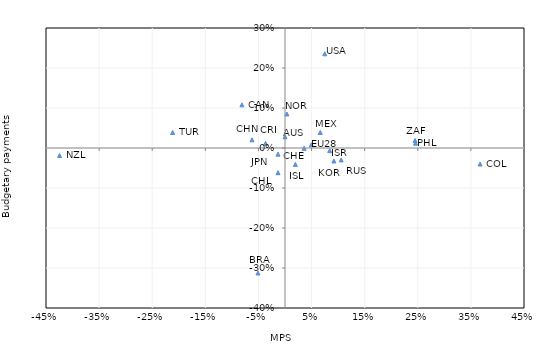
| Category | Series 0 |
|---|---|
| 0.0 | 0.028 |
| -0.05084936944166 | -0.312 |
| -0.0811446334090094 | 0.108 |
| 0.0360775307122881 | -0.001 |
| -0.0131388081672167 | -0.062 |
| -0.0620970592632985 | 0.02 |
| 0.367326479049697 | -0.04 |
| 0.0495603196319397 | 0.008 |
| 0.0194909380179662 | -0.041 |
| 0.0842162466193015 | -0.007 |
| -0.0131233563121294 | -0.015 |
| 0.092031244188044 | -0.032 |
| 0.0663751122827458 | 0.039 |
| 0.00358715191052695 | 0.085 |
| -0.424419548319641 | -0.019 |
| 0.105791779230153 | -0.03 |
| -0.211539065924336 | 0.039 |
| 0.0748792698887465 | 0.236 |
| 0.244795612678182 | 0.019 |
| 0.245755996235346 | 0.012 |
| -0.0366000004161184 | 0.012 |